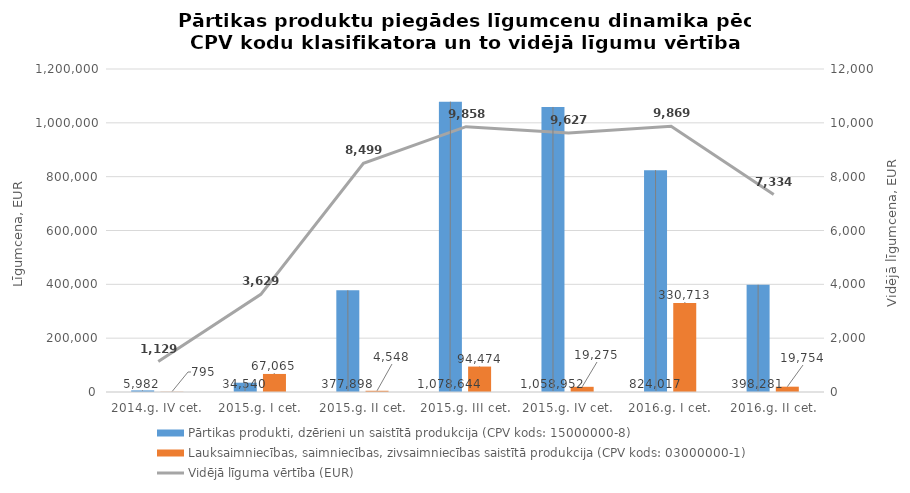
| Category | Pārtikas produkti, dzērieni un saistītā produkcija (CPV kods: 15000000-8) | Lauksaimniecības, saimniecības, zivsaimniecības saistītā produkcija (CPV kods: 03000000-1) |
|---|---|---|
| 2014.g. IV cet. | 5982 | 795 |
| 2015.g. I cet. | 34540 | 67065 |
| 2015.g. II cet. | 377898 | 4548 |
| 2015.g. III cet. | 1078644 | 94474 |
| 2015.g. IV cet. | 1058952 | 19275 |
| 2016.g. I cet. | 824017 | 330713 |
| 2016.g. II cet. | 398281 | 19754 |